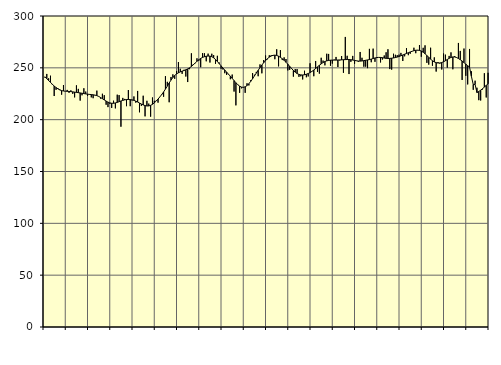
| Category | Piggar | Series 1 |
|---|---|---|
| nan | 240.5 | 241.34 |
| 1.0 | 244.1 | 239.52 |
| 1.0 | 239.9 | 237.78 |
| 1.0 | 242.4 | 235.94 |
| 1.0 | 233.6 | 234.16 |
| 1.0 | 222.8 | 232.46 |
| 1.0 | 228.8 | 231.01 |
| 1.0 | 230.4 | 229.73 |
| 1.0 | 229.3 | 228.68 |
| 1.0 | 224.1 | 228.02 |
| 1.0 | 233.4 | 227.64 |
| 1.0 | 227.5 | 227.45 |
| nan | 228.7 | 227.35 |
| 2.0 | 225.9 | 227.24 |
| 2.0 | 228.3 | 227.06 |
| 2.0 | 224.9 | 226.83 |
| 2.0 | 221.5 | 226.57 |
| 2.0 | 233.1 | 226.3 |
| 2.0 | 229.7 | 226.05 |
| 2.0 | 218.4 | 225.78 |
| 2.0 | 223.5 | 225.48 |
| 2.0 | 230.3 | 225.16 |
| 2.0 | 227.1 | 224.86 |
| 2.0 | 222.9 | 224.59 |
| nan | 224.7 | 224.38 |
| 3.0 | 221.5 | 224.21 |
| 3.0 | 220.7 | 224 |
| 3.0 | 223.4 | 223.7 |
| 3.0 | 228 | 223.2 |
| 3.0 | 222.6 | 222.42 |
| 3.0 | 220.3 | 221.39 |
| 3.0 | 225 | 220.23 |
| 3.0 | 223.6 | 219.04 |
| 3.0 | 214.4 | 217.92 |
| 3.0 | 212.1 | 216.92 |
| 3.0 | 215.3 | 216.19 |
| nan | 211.3 | 215.82 |
| 4.0 | 218.3 | 215.81 |
| 4.0 | 210.9 | 216.14 |
| 4.0 | 224.1 | 216.67 |
| 4.0 | 223.7 | 217.32 |
| 4.0 | 193.2 | 218.01 |
| 4.0 | 221 | 218.62 |
| 4.0 | 220 | 219.1 |
| 4.0 | 213 | 219.38 |
| 4.0 | 228.6 | 219.44 |
| 4.0 | 213 | 219.36 |
| 4.0 | 218.6 | 219.1 |
| nan | 222.4 | 218.61 |
| 5.0 | 216.4 | 217.91 |
| 5.0 | 227.7 | 217.03 |
| 5.0 | 207.1 | 216.07 |
| 5.0 | 213.3 | 215.07 |
| 5.0 | 223.1 | 214.22 |
| 5.0 | 203.2 | 213.59 |
| 5.0 | 218.2 | 213.2 |
| 5.0 | 215.5 | 213.26 |
| 5.0 | 202.9 | 213.81 |
| 5.0 | 221.4 | 214.8 |
| 5.0 | 218.2 | 216.22 |
| nan | 218.3 | 217.96 |
| 6.0 | 216.4 | 219.89 |
| 6.0 | 221.9 | 221.98 |
| 6.0 | 223.8 | 224.26 |
| 6.0 | 222.1 | 226.77 |
| 6.0 | 242 | 229.48 |
| 6.0 | 236.5 | 232.38 |
| 6.0 | 216.8 | 235.36 |
| 6.0 | 241.2 | 238.15 |
| 6.0 | 243.7 | 240.6 |
| 6.0 | 239.4 | 242.62 |
| 6.0 | 246.9 | 244.14 |
| nan | 255.6 | 245.24 |
| 7.0 | 249.1 | 246.09 |
| 7.0 | 244.2 | 246.79 |
| 7.0 | 248.1 | 247.42 |
| 7.0 | 241.6 | 248.12 |
| 7.0 | 236.3 | 248.95 |
| 7.0 | 248.7 | 249.99 |
| 7.0 | 264 | 251.33 |
| 7.0 | 253.6 | 252.93 |
| 7.0 | 254.4 | 254.63 |
| 7.0 | 259.2 | 256.3 |
| 7.0 | 256.8 | 257.82 |
| nan | 250.6 | 259.08 |
| 8.0 | 264.1 | 260.03 |
| 8.0 | 264.1 | 260.73 |
| 8.0 | 256.3 | 261.19 |
| 8.0 | 263.7 | 261.39 |
| 8.0 | 255.1 | 261.27 |
| 8.0 | 263.6 | 260.73 |
| 8.0 | 262.3 | 259.65 |
| 8.0 | 253.9 | 258.06 |
| 8.0 | 261.6 | 256.13 |
| 8.0 | 255.1 | 254.04 |
| 8.0 | 249.1 | 251.91 |
| nan | 248.4 | 249.83 |
| 9.0 | 244.8 | 247.84 |
| 9.0 | 243.2 | 245.86 |
| 9.0 | 243.6 | 243.89 |
| 9.0 | 239 | 241.9 |
| 9.0 | 243.5 | 239.82 |
| 9.0 | 227.1 | 237.7 |
| 9.0 | 213.8 | 235.62 |
| 9.0 | 233.6 | 233.77 |
| 9.0 | 225.9 | 232.32 |
| 9.0 | 230.2 | 231.42 |
| 9.0 | 230.9 | 231.2 |
| nan | 225.9 | 231.7 |
| 10.0 | 235.1 | 232.88 |
| 10.0 | 233 | 234.68 |
| 10.0 | 238.1 | 236.94 |
| 10.0 | 244.9 | 239.5 |
| 10.0 | 243.3 | 242.21 |
| 10.0 | 246.1 | 244.93 |
| 10.0 | 241.9 | 247.62 |
| 10.0 | 253.3 | 250.22 |
| 10.0 | 244.7 | 252.7 |
| 10.0 | 257.5 | 254.99 |
| 10.0 | 261.9 | 257.04 |
| nan | 258.2 | 258.82 |
| 11.0 | 262.1 | 260.3 |
| 11.0 | 262.1 | 261.37 |
| 11.0 | 262.3 | 262.04 |
| 11.0 | 258.3 | 262.24 |
| 11.0 | 267.9 | 261.94 |
| 11.0 | 251.4 | 261.22 |
| 11.0 | 267.1 | 260.14 |
| 11.0 | 257.5 | 258.79 |
| 11.0 | 260.1 | 257.2 |
| 11.0 | 258.5 | 255.42 |
| 11.0 | 247.5 | 253.49 |
| nan | 248.1 | 251.43 |
| 12.0 | 249 | 249.38 |
| 12.0 | 241.5 | 247.48 |
| 12.0 | 248.8 | 245.81 |
| 12.0 | 248.8 | 244.49 |
| 12.0 | 241.3 | 243.63 |
| 12.0 | 241.8 | 243.18 |
| 12.0 | 238.8 | 243.11 |
| 12.0 | 247.2 | 243.34 |
| 12.0 | 240.9 | 243.83 |
| 12.0 | 241.7 | 244.51 |
| 12.0 | 254.4 | 245.41 |
| nan | 246.4 | 246.56 |
| 13.0 | 241.9 | 247.9 |
| 13.0 | 256.6 | 249.37 |
| 13.0 | 246.1 | 250.92 |
| 13.0 | 244.4 | 252.43 |
| 13.0 | 259.7 | 253.82 |
| 13.0 | 257 | 255.1 |
| 13.0 | 252.4 | 256.1 |
| 13.0 | 263.6 | 256.74 |
| 13.0 | 263.4 | 257.14 |
| 13.0 | 252 | 257.37 |
| 13.0 | 254.1 | 257.46 |
| nan | 258 | 257.46 |
| 14.0 | 260.5 | 257.48 |
| 14.0 | 250.8 | 257.55 |
| 14.0 | 257.1 | 257.62 |
| 14.0 | 261.4 | 257.72 |
| 14.0 | 245.2 | 257.83 |
| 14.0 | 279.8 | 257.93 |
| 14.0 | 261.6 | 258.03 |
| 14.0 | 244 | 258.01 |
| 14.0 | 255.8 | 257.84 |
| 14.0 | 261.5 | 257.52 |
| 14.0 | 253.9 | 257.16 |
| nan | 257 | 256.81 |
| 15.0 | 255.8 | 256.56 |
| 15.0 | 265.3 | 256.48 |
| 15.0 | 259.7 | 256.63 |
| 15.0 | 251.1 | 256.93 |
| 15.0 | 251.1 | 257.29 |
| 15.0 | 249.7 | 257.63 |
| 15.0 | 268.3 | 257.95 |
| 15.0 | 255.4 | 258.41 |
| 15.0 | 268.5 | 259 |
| 15.0 | 255.8 | 259.53 |
| 15.0 | 260.4 | 259.9 |
| nan | 260 | 260.07 |
| 16.0 | 255.2 | 260 |
| 16.0 | 258 | 259.76 |
| 16.0 | 261.9 | 259.44 |
| 16.0 | 265 | 259.16 |
| 16.0 | 267.9 | 259.04 |
| 16.0 | 248.8 | 259.09 |
| 16.0 | 248.3 | 259.29 |
| 16.0 | 263.6 | 259.55 |
| 16.0 | 262.6 | 259.91 |
| 16.0 | 262.2 | 260.38 |
| 16.0 | 262.7 | 260.95 |
| nan | 264.4 | 261.62 |
| 17.0 | 256.6 | 262.38 |
| 17.0 | 261.1 | 263.13 |
| 17.0 | 269 | 263.88 |
| 17.0 | 262.2 | 264.61 |
| 17.0 | 263.6 | 265.29 |
| 17.0 | 265.9 | 265.93 |
| 17.0 | 269.4 | 266.52 |
| 17.0 | 264.1 | 266.95 |
| 17.0 | 266.8 | 267.07 |
| 17.0 | 272 | 266.81 |
| 17.0 | 260.7 | 266.16 |
| nan | 269.3 | 265.09 |
| 18.0 | 271.7 | 263.63 |
| 18.0 | 254.8 | 261.94 |
| 18.0 | 253.1 | 260.14 |
| 18.0 | 269.4 | 258.36 |
| 18.0 | 252 | 256.84 |
| 18.0 | 260.1 | 255.7 |
| 18.0 | 246.4 | 254.99 |
| 18.0 | 255.5 | 254.67 |
| 18.0 | 254.1 | 254.69 |
| 18.0 | 248.4 | 255.12 |
| 18.0 | 263.8 | 255.85 |
| nan | 262.7 | 256.85 |
| 19.0 | 250.2 | 258.03 |
| 19.0 | 261.5 | 259.16 |
| 19.0 | 264.9 | 260.04 |
| 19.0 | 248.6 | 260.52 |
| 19.0 | 261.4 | 260.47 |
| 19.0 | 260.2 | 259.93 |
| 19.0 | 274 | 259.01 |
| 19.0 | 266.3 | 257.86 |
| 19.0 | 238.3 | 256.54 |
| 19.0 | 268.6 | 255.05 |
| 19.0 | 242.3 | 253.53 |
| nan | 234 | 252.04 |
| 20.0 | 268.2 | 250.72 |
| 20.0 | 246.7 | 241.84 |
| 20.0 | 228.8 | 233.95 |
| 20.0 | 237.6 | 234.04 |
| 20.0 | 230.8 | 226.14 |
| 20.0 | 218.8 | 227.17 |
| 20.0 | 218.5 | 228.45 |
| 20.0 | 229.1 | 229.87 |
| 20.0 | 244.8 | 231.44 |
| 20.0 | 221.4 | 233.08 |
| 20.0 | 245.2 | 234.64 |